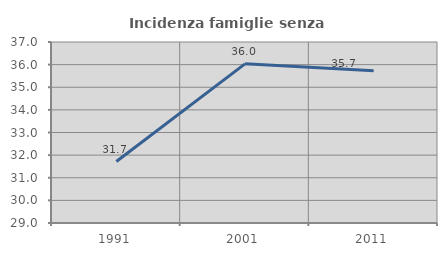
| Category | Incidenza famiglie senza nuclei |
|---|---|
| 1991.0 | 31.717 |
| 2001.0 | 36.034 |
| 2011.0 | 35.727 |